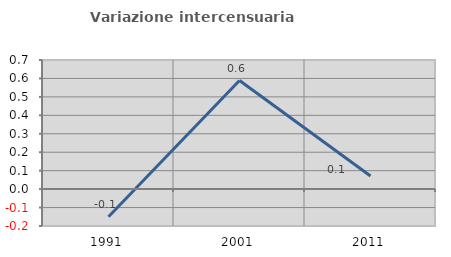
| Category | Variazione intercensuaria annua |
|---|---|
| 1991.0 | -0.15 |
| 2001.0 | 0.588 |
| 2011.0 | 0.071 |